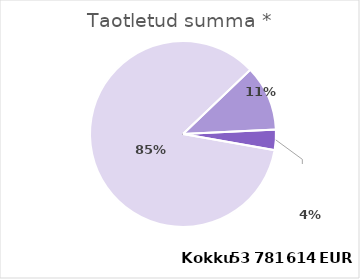
| Category | Taotletud summa |
|---|---|
| PRG | 45766265 |
| PSG | 6116349 |
| PUTJD | 1899000 |